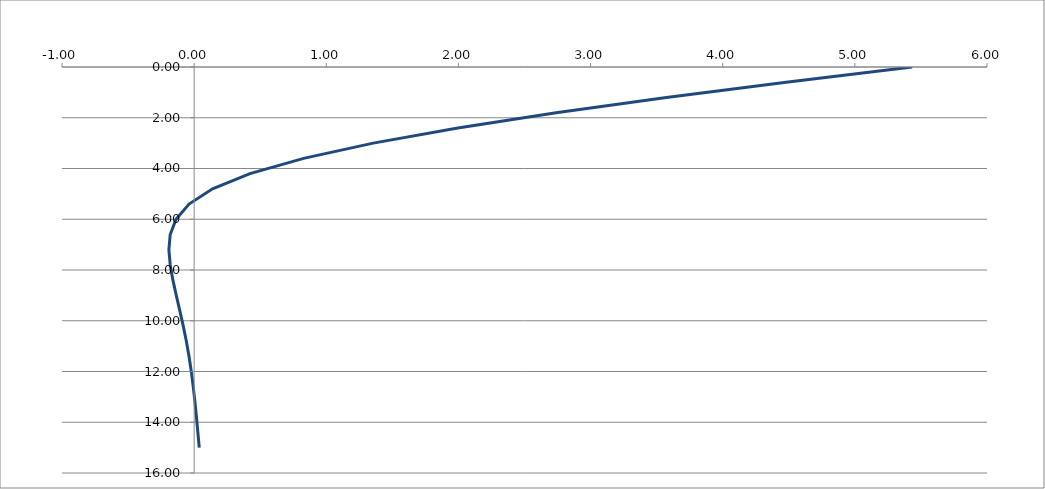
| Category | Series 4 |
|---|---|
| 5.433163981907778 | 0 |
| 4.4799703543669676 | 0.6 |
| 3.5737845529235117 | 1.2 |
| 2.739486386209993 | 1.8 |
| 1.9954852259377243 | 2.4 |
| 1.3552199433520098 | 3 |
| 0.8284974015512657 | 3.6 |
| 0.4226448509706035 | 4.2 |
| 0.13929663926001792 | 4.8 |
| -0.03857178603248471 | 5.4 |
| -0.13699038828290136 | 6 |
| -0.18110659212262964 | 6.6 |
| -0.19105848405809184 | 7.2 |
| -0.18115186245346207 | 7.8 |
| -0.16066495537986455 | 8.4 |
| -0.13526128772721735 | 9 |
| -0.1084523882444816 | 9.6 |
| -0.08264911791384551 | 10.2 |
| -0.05926568304463489 | 10.8 |
| -0.0388920252768542 | 11.4 |
| -0.02152491772084394 | 12 |
| -0.0067701713326208625 | 12.6 |
| 0.005984350920023526 | 13.2 |
| 0.017421286103445767 | 13.8 |
| 0.028166058236286023 | 14.4 |
| 0.038672336409621026 | 15 |